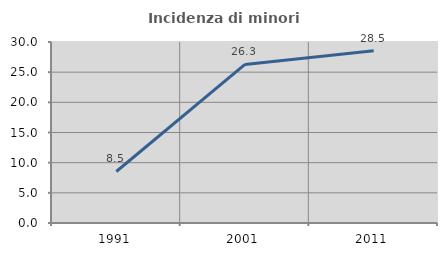
| Category | Incidenza di minori stranieri |
|---|---|
| 1991.0 | 8.537 |
| 2001.0 | 26.288 |
| 2011.0 | 28.545 |